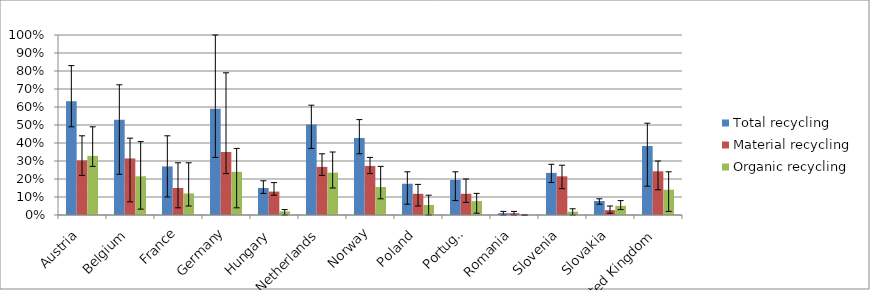
| Category | Total recycling | Material recycling | Organic recycling |
|---|---|---|---|
| Austria | 0.632 | 0.303 | 0.329 |
| Belgium | 0.53 | 0.314 | 0.215 |
| France | 0.27 | 0.15 | 0.12 |
| Germany | 0.59 | 0.35 | 0.24 |
| Hungary | 0.15 | 0.13 | 0.02 |
| Netherlands | 0.503 | 0.267 | 0.236 |
| Norway | 0.428 | 0.273 | 0.155 |
| Poland | 0.174 | 0.118 | 0.056 |
| Portugal | 0.195 | 0.118 | 0.077 |
| Romania | 0.01 | 0.01 | 0 |
| Slovenia | 0.234 | 0.215 | 0.019 |
| Slovakia | 0.078 | 0.027 | 0.051 |
| United Kingdom | 0.383 | 0.243 | 0.14 |